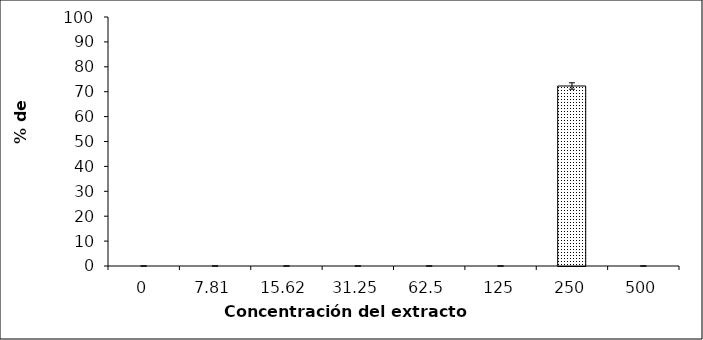
| Category | Series 0 |
|---|---|
| 0.0 | 0 |
| 7.81 | 0 |
| 15.62 | 0 |
| 31.25 | 0 |
| 62.5 | 0 |
| 125.0 | 0 |
| 250.0 | 72.291 |
| 500.0 | 0 |